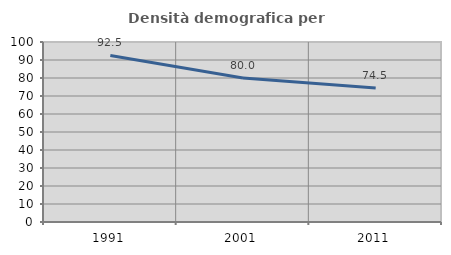
| Category | Densità demografica |
|---|---|
| 1991.0 | 92.507 |
| 2001.0 | 80.002 |
| 2011.0 | 74.46 |